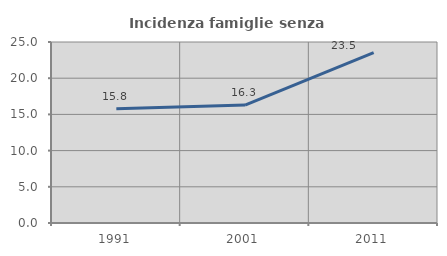
| Category | Incidenza famiglie senza nuclei |
|---|---|
| 1991.0 | 15.778 |
| 2001.0 | 16.287 |
| 2011.0 | 23.546 |